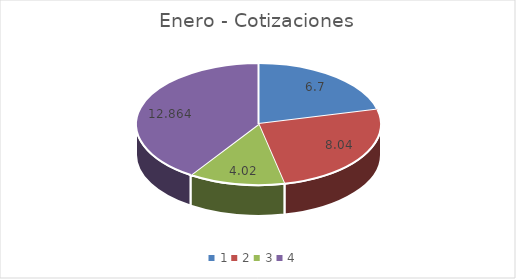
| Category | Enero |
|---|---|
| 0 | 6.7 |
| 1 | 8.04 |
| 2 | 4.02 |
| 3 | 12.864 |